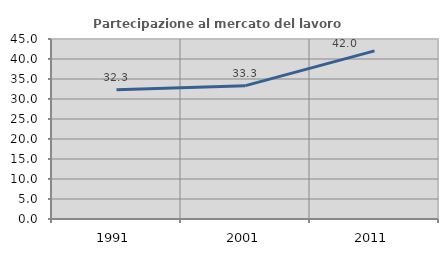
| Category | Partecipazione al mercato del lavoro  femminile |
|---|---|
| 1991.0 | 32.287 |
| 2001.0 | 33.333 |
| 2011.0 | 42.035 |